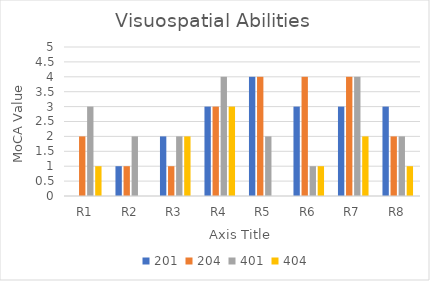
| Category | 201 | 204 | 401 | 404 |
|---|---|---|---|---|
| R1 | 0 | 2 | 3 | 1 |
| R2 | 1 | 1 | 2 | 0 |
| R3 | 2 | 1 | 2 | 2 |
| R4 | 3 | 3 | 4 | 3 |
| R5 | 4 | 4 | 2 | 0 |
| R6 | 3 | 4 | 1 | 1 |
| R7 | 3 | 4 | 4 | 2 |
| R8 | 3 | 2 | 2 | 1 |